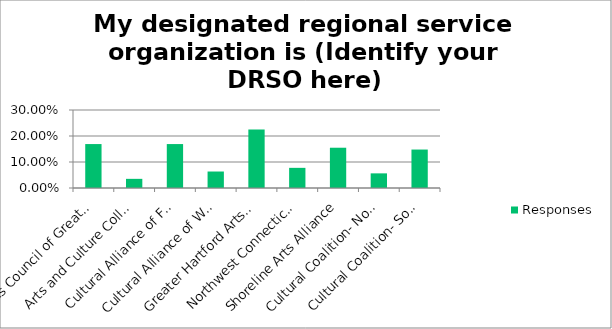
| Category | Responses |
|---|---|
| Arts Council of Greater New Haven | 0.169 |
| Arts and Culture Collaborative, Waterbury Region | 0.035 |
| Cultural Alliance of Fairfield County | 0.169 |
| Cultural Alliance of Western Connecticut | 0.063 |
| Greater Hartford Arts Council | 0.225 |
| Northwest Connecticut Arts Council | 0.078 |
| Shoreline Arts Alliance | 0.155 |
| Cultural Coalition- Northeast Region | 0.056 |
| Cultural Coalition- Southeast Region | 0.148 |